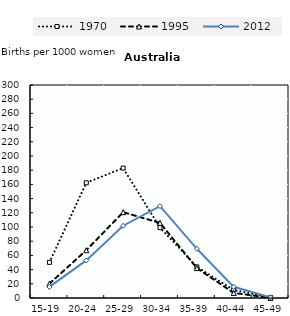
| Category | 1970 | 1995 | 2012 |
|---|---|---|---|
| 15-19 | 50.189 | 20.162 | 15.593 |
| 20-24 | 162.273 | 67.263 | 52.936 |
| 25-29 | 182.971 | 120.825 | 101.777 |
| 30-34 | 99.161 | 105.79 | 129.366 |
| 35-39 | 43.854 | 42.12 | 69.281 |
| 40-44 | 11.246 | 7.168 | 15.733 |
| 45-49 | 0.741 | 0.261 | 0.879 |